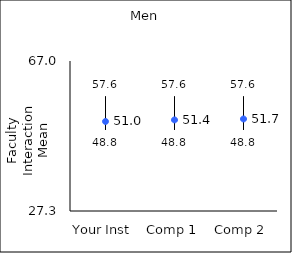
| Category | 25th percentile | 75th percentile | Mean |
|---|---|---|---|
| Your Inst | 48.8 | 57.6 | 50.99 |
| Comp 1 | 48.8 | 57.6 | 51.41 |
| Comp 2 | 48.8 | 57.6 | 51.66 |